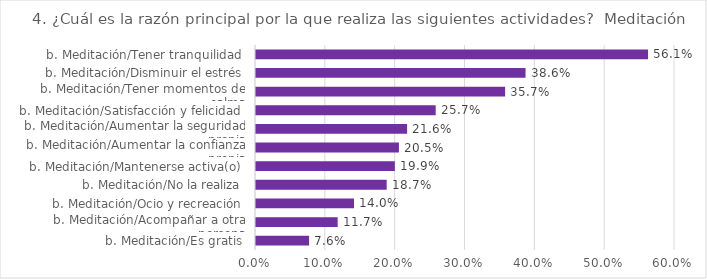
| Category | % del N de columna |
|---|---|
| b. Meditación/Es gratis | 0.076 |
| b. Meditación/Acompañar a otra persona | 0.117 |
| b. Meditación/Ocio y recreación | 0.14 |
| b. Meditación/No la realiza | 0.187 |
| b. Meditación/Mantenerse activa(o) | 0.199 |
| b. Meditación/Aumentar la confianza propia | 0.205 |
| b. Meditación/Aumentar la seguridad propia | 0.216 |
| b. Meditación/Satisfacción y felicidad | 0.257 |
| b. Meditación/Tener momentos de calma | 0.357 |
| b. Meditación/Disminuir el estrés | 0.386 |
| b. Meditación/Tener tranquilidad | 0.561 |